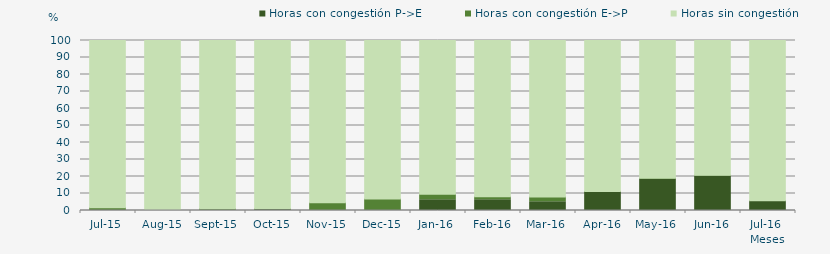
| Category | Horas con congestión P->E | Horas con congestión E->P | Horas sin congestión |
|---|---|---|---|
| 2015-07-01 | 0 | 1.613 | 98.387 |
| 2015-08-01 | 0 | 0.269 | 99.731 |
| 2015-09-01 | 0 | 0.972 | 99.028 |
| 2015-10-01 | 0.672 | 0.403 | 98.925 |
| 2015-11-01 | 0 | 4.583 | 95.417 |
| 2015-12-01 | 0 | 6.72 | 93.28 |
| 2016-01-01 | 6.317 | 3.226 | 90.457 |
| 2016-02-01 | 6.322 | 1.724 | 91.954 |
| 2016-03-01 | 5.108 | 2.858 | 92.035 |
| 2016-04-01 | 11.25 | 0 | 88.75 |
| 2016-05-01 | 18.28 | 0.672 | 81.048 |
| 2016-06-01 | 20.139 | 0.556 | 79.306 |
| 2016-07-01 | 5.78 | 0 | 94.22 |